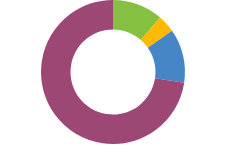
| Category | Turtas |
|---|---|
| GRYNIEJI PINIGAI | 43300 |
| INVESTICIJOS | 15000 |
| IŠPIRKIMAS | 46000 |
| ASMENINIS | 276500 |